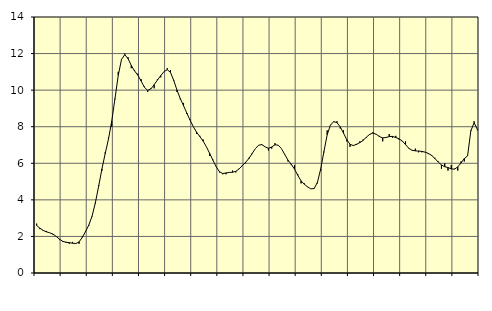
| Category | Piggar | Series 1 |
|---|---|---|
| nan | 2.7 | 2.6 |
| 87.0 | 2.4 | 2.45 |
| 87.0 | 2.3 | 2.33 |
| 87.0 | 2.3 | 2.25 |
| nan | 2.2 | 2.2 |
| 88.0 | 2.1 | 2.13 |
| 88.0 | 2 | 2 |
| 88.0 | 1.8 | 1.85 |
| nan | 1.7 | 1.73 |
| 89.0 | 1.7 | 1.68 |
| 89.0 | 1.6 | 1.66 |
| 89.0 | 1.7 | 1.63 |
| nan | 1.6 | 1.61 |
| 90.0 | 1.6 | 1.7 |
| 90.0 | 2 | 1.95 |
| 90.0 | 2.3 | 2.27 |
| nan | 2.6 | 2.63 |
| 91.0 | 3.1 | 3.12 |
| 91.0 | 3.8 | 3.85 |
| 91.0 | 4.8 | 4.75 |
| nan | 5.6 | 5.69 |
| 92.0 | 6.6 | 6.53 |
| 92.0 | 7.4 | 7.32 |
| 92.0 | 8 | 8.3 |
| nan | 9.5 | 9.54 |
| 93.0 | 11 | 10.81 |
| 93.0 | 11.7 | 11.68 |
| 93.0 | 12 | 11.94 |
| nan | 11.8 | 11.72 |
| 94.0 | 11.2 | 11.35 |
| 94.0 | 11.1 | 11.05 |
| 94.0 | 10.9 | 10.82 |
| nan | 10.6 | 10.5 |
| 95.0 | 10.2 | 10.16 |
| 95.0 | 9.9 | 9.99 |
| 95.0 | 10.1 | 10.07 |
| nan | 10.1 | 10.3 |
| 96.0 | 10.6 | 10.55 |
| 96.0 | 10.7 | 10.79 |
| 96.0 | 11 | 11.01 |
| nan | 11.2 | 11.12 |
| 97.0 | 11.1 | 10.97 |
| 97.0 | 10.5 | 10.53 |
| 97.0 | 9.9 | 10 |
| nan | 9.5 | 9.54 |
| 98.0 | 9.3 | 9.15 |
| 98.0 | 8.7 | 8.75 |
| 98.0 | 8.4 | 8.36 |
| nan | 8 | 8 |
| 99.0 | 7.6 | 7.7 |
| 99.0 | 7.5 | 7.46 |
| 99.0 | 7.3 | 7.21 |
| nan | 6.9 | 6.9 |
| 0.0 | 6.4 | 6.54 |
| 0.0 | 6.2 | 6.17 |
| 0.0 | 5.8 | 5.81 |
| nan | 5.5 | 5.54 |
| 1.0 | 5.4 | 5.44 |
| 1.0 | 5.4 | 5.47 |
| 1.0 | 5.5 | 5.5 |
| nan | 5.6 | 5.51 |
| 2.0 | 5.5 | 5.56 |
| 2.0 | 5.7 | 5.69 |
| 2.0 | 5.9 | 5.87 |
| nan | 6 | 6.05 |
| 3.0 | 6.3 | 6.26 |
| 3.0 | 6.5 | 6.53 |
| 3.0 | 6.8 | 6.8 |
| nan | 7 | 6.99 |
| 4.0 | 7 | 7.02 |
| 4.0 | 6.9 | 6.9 |
| 4.0 | 6.7 | 6.82 |
| nan | 6.8 | 6.89 |
| 5.0 | 7.1 | 7.01 |
| 5.0 | 7 | 6.99 |
| 5.0 | 6.8 | 6.8 |
| nan | 6.5 | 6.48 |
| 6.0 | 6.1 | 6.17 |
| 6.0 | 5.9 | 5.94 |
| 6.0 | 5.9 | 5.68 |
| nan | 5.4 | 5.34 |
| 7.0 | 4.9 | 5.04 |
| 7.0 | 4.9 | 4.85 |
| 7.0 | 4.7 | 4.71 |
| nan | 4.6 | 4.6 |
| 8.0 | 4.6 | 4.62 |
| 8.0 | 4.9 | 4.95 |
| 8.0 | 5.6 | 5.68 |
| nan | 6.6 | 6.64 |
| 9.0 | 7.8 | 7.56 |
| 9.0 | 8.1 | 8.09 |
| 9.0 | 8.3 | 8.28 |
| nan | 8.3 | 8.22 |
| 10.0 | 7.9 | 7.99 |
| 10.0 | 7.8 | 7.65 |
| 10.0 | 7.2 | 7.29 |
| nan | 6.9 | 7.04 |
| 11.0 | 7 | 6.97 |
| 11.0 | 7 | 7.04 |
| 11.0 | 7.2 | 7.13 |
| nan | 7.3 | 7.25 |
| 12.0 | 7.4 | 7.43 |
| 12.0 | 7.6 | 7.58 |
| 12.0 | 7.7 | 7.65 |
| nan | 7.6 | 7.59 |
| 13.0 | 7.5 | 7.46 |
| 13.0 | 7.2 | 7.39 |
| 13.0 | 7.4 | 7.41 |
| nan | 7.6 | 7.46 |
| 14.0 | 7.4 | 7.47 |
| 14.0 | 7.5 | 7.41 |
| 14.0 | 7.3 | 7.34 |
| nan | 7.2 | 7.22 |
| 15.0 | 7.2 | 7.02 |
| 15.0 | 6.8 | 6.82 |
| 15.0 | 6.7 | 6.71 |
| nan | 6.8 | 6.68 |
| 16.0 | 6.6 | 6.67 |
| 16.0 | 6.6 | 6.65 |
| 16.0 | 6.6 | 6.61 |
| nan | 6.5 | 6.54 |
| 17.0 | 6.4 | 6.43 |
| 17.0 | 6.3 | 6.26 |
| 17.0 | 6.1 | 6.07 |
| nan | 5.7 | 5.91 |
| 18.0 | 6 | 5.81 |
| 18.0 | 5.6 | 5.77 |
| 18.0 | 5.9 | 5.69 |
| nan | 5.7 | 5.68 |
| 19.0 | 5.6 | 5.8 |
| 19.0 | 6.1 | 6.02 |
| 19.0 | 6.1 | 6.26 |
| nan | 6.4 | 6.4 |
| 20.0 | 7.8 | 7.77 |
| 20.0 | 8.3 | 8.22 |
| 20.0 | 7.8 | 7.85 |